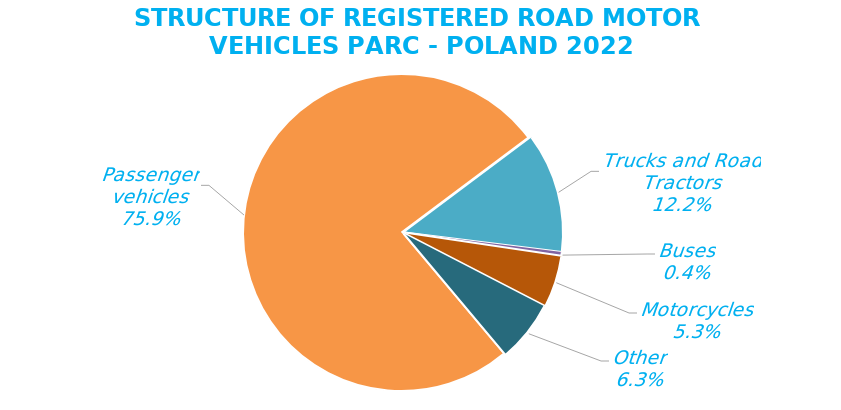
| Category | "Road motor vehicles" |
|---|---|
| 0 | 26457659 |
| 1 | 4251226 |
| 2 | 128677 |
| 3 | 1830963 |
| 4 | 2197612 |